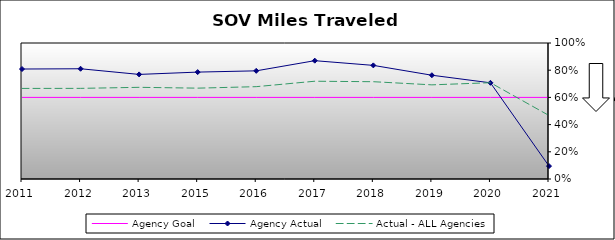
| Category | Agency Goal | Agency Actual | Actual - ALL Agencies |
|---|---|---|---|
| 2011.0 | 0.6 | 0.809 | 0.666 |
| 2012.0 | 0.6 | 0.811 | 0.666 |
| 2013.0 | 0.6 | 0.769 | 0.674 |
| 2015.0 | 0.6 | 0.786 | 0.668 |
| 2016.0 | 0.6 | 0.795 | 0.679 |
| 2017.0 | 0.6 | 0.87 | 0.719 |
| 2018.0 | 0.6 | 0.835 | 0.715 |
| 2019.0 | 0.6 | 0.763 | 0.692 |
| 2020.0 | 0.6 | 0.707 | 0.708 |
| 2021.0 | 0.6 | 0.095 | 0.467 |